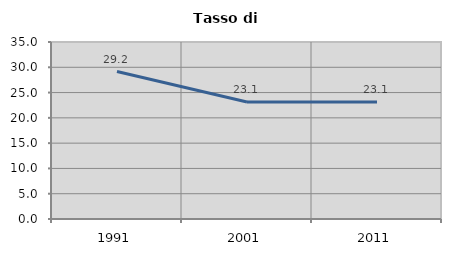
| Category | Tasso di disoccupazione   |
|---|---|
| 1991.0 | 29.153 |
| 2001.0 | 23.144 |
| 2011.0 | 23.121 |